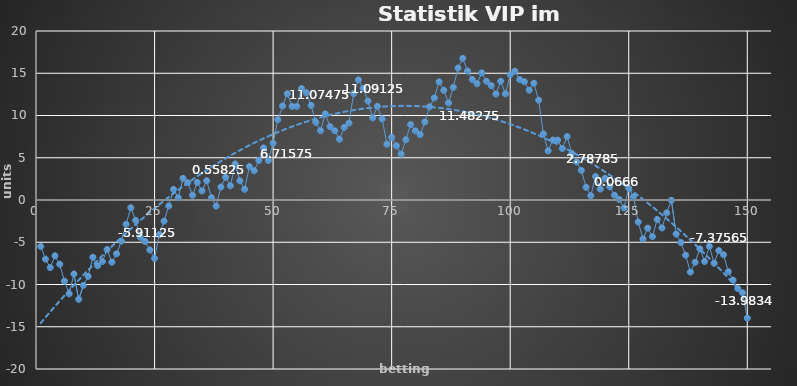
| Category | Series 0 |
|---|---|
| 0 | -5.5 |
| 1 | -7 |
| 2 | -8 |
| 3 | -6.605 |
| 4 | -7.605 |
| 5 | -9.605 |
| 6 | -11.105 |
| 7 | -8.754 |
| 8 | -11.754 |
| 9 | -10.097 |
| 10 | -9.037 |
| 11 | -6.777 |
| 12 | -7.777 |
| 13 | -7.277 |
| 14 | -5.867 |
| 15 | -7.367 |
| 16 | -6.367 |
| 17 | -4.867 |
| 18 | -2.874 |
| 19 | -0.911 |
| 20 | -2.411 |
| 21 | -4.411 |
| 22 | -4.911 |
| 23 | -5.911 |
| 24 | -6.911 |
| 25 | -4.086 |
| 26 | -2.504 |
| 27 | -0.704 |
| 28 | 1.261 |
| 29 | 0.261 |
| 30 | 2.558 |
| 31 | 2.058 |
| 32 | 0.558 |
| 33 | 2.076 |
| 34 | 1.076 |
| 35 | 2.276 |
| 36 | 0.276 |
| 37 | -0.724 |
| 38 | 1.532 |
| 39 | 2.682 |
| 40 | 1.682 |
| 41 | 4.268 |
| 42 | 2.268 |
| 43 | 1.268 |
| 44 | 3.968 |
| 45 | 3.468 |
| 46 | 4.686 |
| 47 | 6.176 |
| 48 | 4.676 |
| 49 | 6.716 |
| 50 | 9.516 |
| 51 | 11.126 |
| 52 | 12.575 |
| 53 | 11.075 |
| 54 | 11.075 |
| 55 | 13.197 |
| 56 | 12.697 |
| 57 | 11.197 |
| 58 | 9.197 |
| 59 | 8.197 |
| 60 | 10.187 |
| 61 | 8.687 |
| 62 | 8.187 |
| 63 | 7.187 |
| 64 | 8.588 |
| 65 | 9.108 |
| 66 | 12.606 |
| 67 | 14.213 |
| 68 | 13.213 |
| 69 | 11.713 |
| 70 | 9.713 |
| 71 | 11.091 |
| 72 | 9.591 |
| 73 | 6.591 |
| 74 | 7.416 |
| 75 | 6.416 |
| 76 | 5.416 |
| 77 | 7.133 |
| 78 | 8.933 |
| 79 | 8.183 |
| 80 | 7.733 |
| 81 | 9.233 |
| 82 | 11.033 |
| 83 | 12.076 |
| 84 | 13.983 |
| 85 | 12.983 |
| 86 | 11.483 |
| 87 | 13.323 |
| 88 | 15.615 |
| 89 | 16.76 |
| 90 | 15.26 |
| 91 | 14.26 |
| 92 | 13.76 |
| 93 | 15.039 |
| 94 | 14.039 |
| 95 | 13.539 |
| 96 | 12.539 |
| 97 | 14.059 |
| 98 | 12.559 |
| 99 | 14.834 |
| 100 | 15.245 |
| 101 | 14.245 |
| 102 | 13.995 |
| 103 | 12.995 |
| 104 | 13.813 |
| 105 | 11.813 |
| 106 | 7.813 |
| 107 | 5.813 |
| 108 | 7.091 |
| 109 | 7.091 |
| 110 | 6.091 |
| 111 | 7.504 |
| 112 | 5.504 |
| 113 | 4.504 |
| 114 | 3.504 |
| 115 | 1.504 |
| 116 | 0.504 |
| 117 | 2.788 |
| 118 | 1.288 |
| 119 | 2.567 |
| 120 | 1.567 |
| 121 | 0.567 |
| 122 | 0.067 |
| 123 | -0.933 |
| 124 | 1.392 |
| 125 | 0.392 |
| 126 | -2.608 |
| 127 | -4.608 |
| 128 | -3.33 |
| 129 | -4.33 |
| 130 | -2.306 |
| 131 | -3.306 |
| 132 | -1.528 |
| 133 | -0.036 |
| 134 | -4.036 |
| 135 | -5.036 |
| 136 | -6.536 |
| 137 | -8.536 |
| 138 | -7.376 |
| 139 | -5.783 |
| 140 | -7.283 |
| 141 | -5.483 |
| 142 | -7.483 |
| 143 | -5.983 |
| 144 | -6.483 |
| 145 | -8.483 |
| 146 | -9.483 |
| 147 | -10.483 |
| 148 | -10.983 |
| 149 | -13.983 |